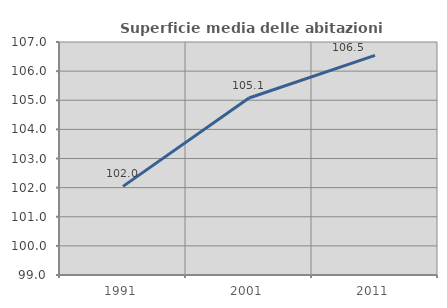
| Category | Superficie media delle abitazioni occupate |
|---|---|
| 1991.0 | 102.042 |
| 2001.0 | 105.078 |
| 2011.0 | 106.538 |